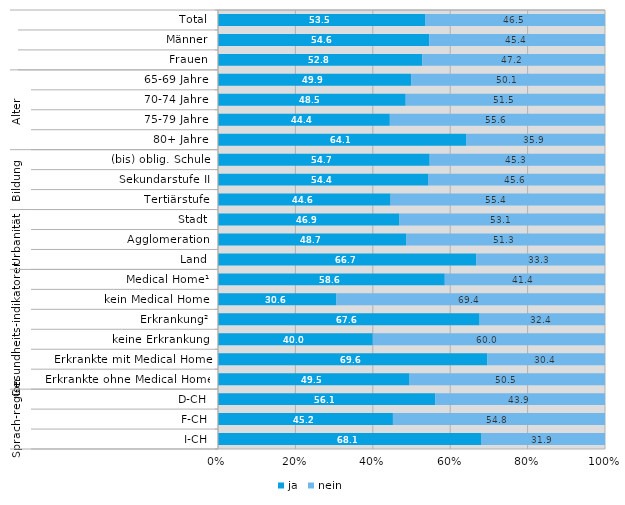
| Category | ja | nein |
|---|---|---|
| 0 | 53.5 | 46.5 |
| 1 | 54.6 | 45.4 |
| 2 | 52.8 | 47.2 |
| 3 | 49.9 | 50.1 |
| 4 | 48.5 | 51.5 |
| 5 | 44.4 | 55.6 |
| 6 | 64.1 | 35.9 |
| 7 | 54.7 | 45.3 |
| 8 | 54.4 | 45.6 |
| 9 | 44.6 | 55.4 |
| 10 | 46.9 | 53.1 |
| 11 | 48.7 | 51.3 |
| 12 | 66.7 | 33.3 |
| 13 | 58.6 | 41.4 |
| 14 | 30.6 | 69.4 |
| 15 | 67.6 | 32.4 |
| 16 | 40 | 60 |
| 17 | 69.6 | 30.4 |
| 18 | 49.5 | 50.5 |
| 19 | 56.1 | 43.9 |
| 20 | 45.2 | 54.8 |
| 21 | 68.1 | 31.9 |